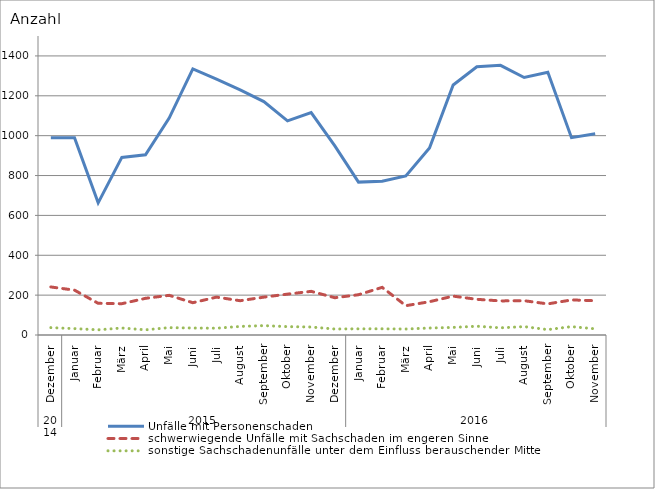
| Category | Unfälle mit Personenschaden | schwerwiegende Unfälle mit Sachschaden im engeren Sinne | sonstige Sachschadenunfälle unter dem Einfluss berauschender Mittel |
|---|---|---|---|
| 0 | 990 | 241 | 37 |
| 1 | 990 | 225 | 32 |
| 2 | 663 | 159 | 26 |
| 3 | 891 | 157 | 35 |
| 4 | 904 | 184 | 26 |
| 5 | 1088 | 199 | 37 |
| 6 | 1335 | 162 | 35 |
| 7 | 1284 | 190 | 34 |
| 8 | 1230 | 172 | 43 |
| 9 | 1171 | 190 | 47 |
| 10 | 1074 | 205 | 42 |
| 11 | 1116 | 219 | 40 |
| 12 | 949 | 187 | 30 |
| 13 | 767 | 202 | 31 |
| 14 | 771 | 239 | 31 |
| 15 | 798 | 147 | 30 |
| 16 | 938 | 167 | 35 |
| 17 | 1254 | 195 | 38 |
| 18 | 1346 | 179 | 44 |
| 19 | 1353 | 171 | 36 |
| 20 | 1292 | 172 | 42 |
| 21 | 1318 | 156 | 27 |
| 22 | 990 | 176 | 42 |
| 23 | 1010 | 172 | 31 |